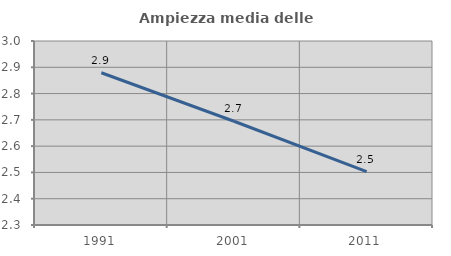
| Category | Ampiezza media delle famiglie |
|---|---|
| 1991.0 | 2.879 |
| 2001.0 | 2.695 |
| 2011.0 | 2.503 |